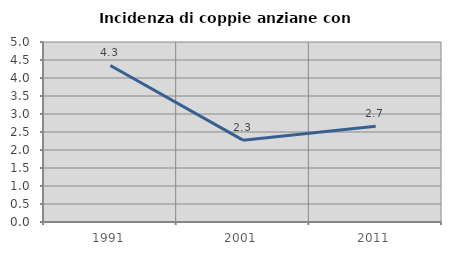
| Category | Incidenza di coppie anziane con figli |
|---|---|
| 1991.0 | 4.348 |
| 2001.0 | 2.273 |
| 2011.0 | 2.66 |